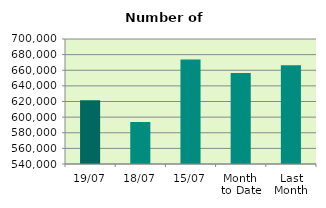
| Category | Series 0 |
|---|---|
| 19/07 | 621594 |
| 18/07 | 593790 |
| 15/07 | 673888 |
| Month 
to Date | 656494 |
| Last
Month | 666251.273 |